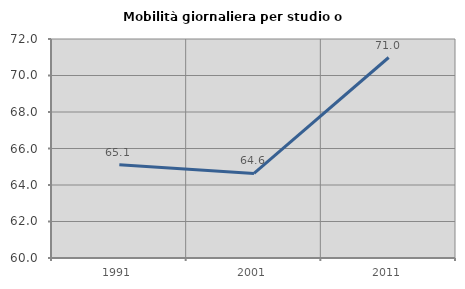
| Category | Mobilità giornaliera per studio o lavoro |
|---|---|
| 1991.0 | 65.107 |
| 2001.0 | 64.632 |
| 2011.0 | 70.986 |